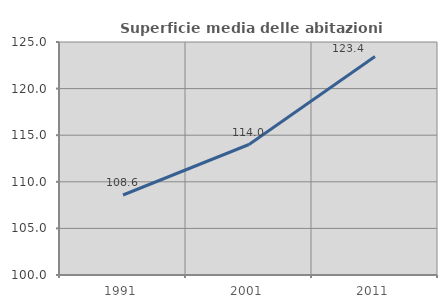
| Category | Superficie media delle abitazioni occupate |
|---|---|
| 1991.0 | 108.583 |
| 2001.0 | 114.001 |
| 2011.0 | 123.439 |